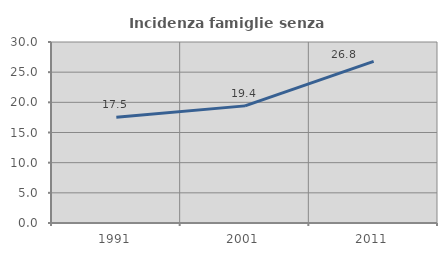
| Category | Incidenza famiglie senza nuclei |
|---|---|
| 1991.0 | 17.534 |
| 2001.0 | 19.412 |
| 2011.0 | 26.794 |